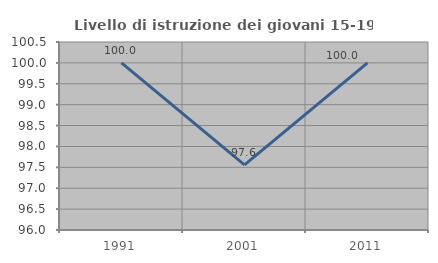
| Category | Livello di istruzione dei giovani 15-19 anni |
|---|---|
| 1991.0 | 100 |
| 2001.0 | 97.561 |
| 2011.0 | 100 |